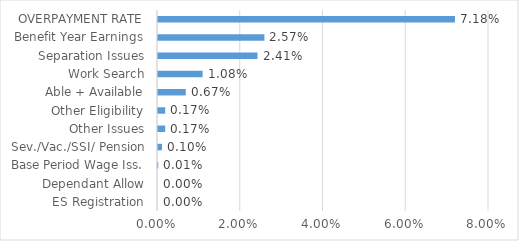
| Category | Series 0 |
|---|---|
| ES Registration | 0 |
| Dependant Allow | 0 |
| Base Period Wage Iss. | 0 |
| Sev./Vac./SSI/ Pension | 0.001 |
| Other Issues | 0.002 |
| Other Eligibility | 0.002 |
| Able + Available | 0.007 |
| Work Search | 0.011 |
| Separation Issues | 0.024 |
| Benefit Year Earnings | 0.026 |
| OVERPAYMENT RATE | 0.072 |